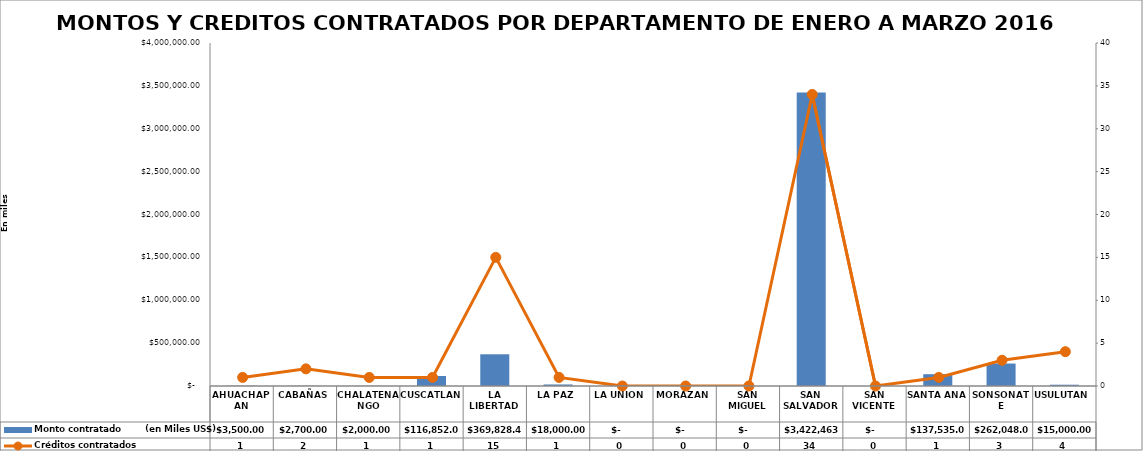
| Category | Monto contratado        (en Miles US$) |
|---|---|
| AHUACHAPAN | 3500 |
| CABAÑAS | 2700 |
| CHALATENANGO | 2000 |
| CUSCATLAN | 116852 |
| LA LIBERTAD | 369828.47 |
| LA PAZ | 18000 |
| LA UNION | 0 |
| MORAZAN | 0 |
| SAN MIGUEL | 0 |
| SAN SALVADOR | 3422463.9 |
| SAN VICENTE | 0 |
| SANTA ANA | 137535 |
| SONSONATE | 262048 |
| USULUTAN | 15000 |